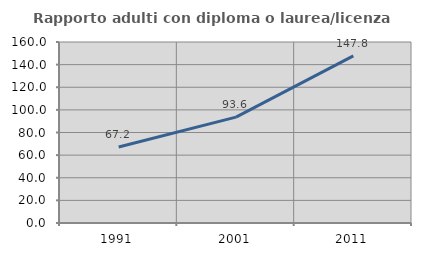
| Category | Rapporto adulti con diploma o laurea/licenza media  |
|---|---|
| 1991.0 | 67.184 |
| 2001.0 | 93.572 |
| 2011.0 | 147.801 |